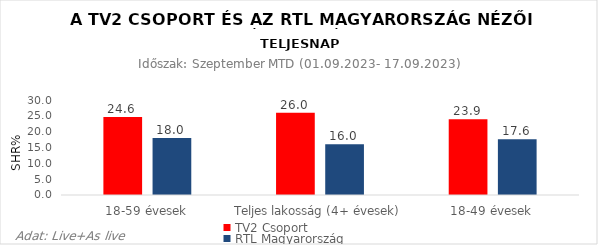
| Category | TV2 Csoport | RTL Magyarország |
|---|---|---|
| 18-59 évesek | 24.6 | 18 |
| Teljes lakosság (4+ évesek) | 26 | 16 |
| 18-49 évesek | 23.9 | 17.6 |